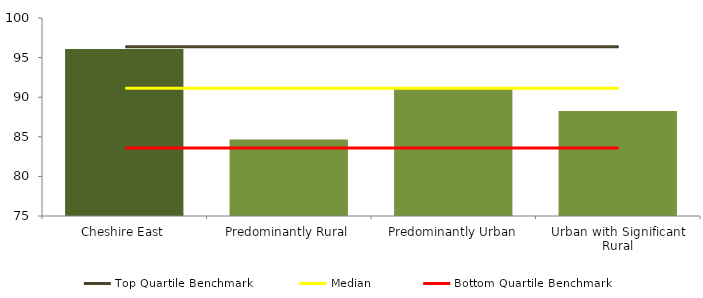
| Category | Series 0 |
|---|---|
| Cheshire East | 96.078 |
| Predominantly Rural | 84.649 |
| Predominantly Urban | 91.266 |
| Urban with Significant Rural | 88.255 |